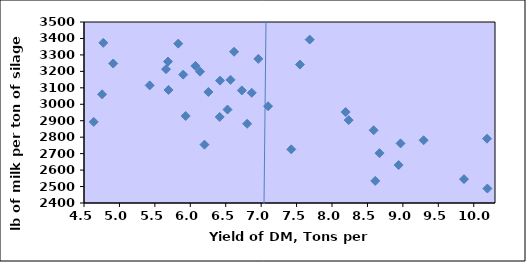
| Category | Series 0 |
|---|---|
| 8.67 | 2702.75 |
| 5.4266667 | 3115 |
| 4.7725 | 3373.5 |
| 6.8675 | 3069.75 |
| 8.235 | 2903.75 |
| 7.0975 | 2988.25 |
| 5.935 | 2928.75 |
| 10.1875 | 2790.75 |
| 8.5875 | 2842 |
| 8.9675 | 2762.25 |
| 6.525 | 2968 |
| 7.5475 | 3241.25 |
| 4.755 | 3060.5 |
| 8.1925 | 2953 |
| 4.6375 | 2892.75 |
| 6.2 | 2754.5 |
| 6.255 | 3074.5 |
| 5.6575 | 3213 |
| 6.5675 | 3148.75 |
| 7.685 | 3393 |
| 5.685 | 3259.75 |
| 6.6175 | 3319.25 |
| 6.7275 | 3084.25 |
| 6.42 | 3143.667 |
| 5.83 | 3368.5 |
| 7.425 | 2726.25 |
| 4.9125 | 3247.75 |
| 5.9 | 3180.25 |
| 6.0725 | 3233.25 |
| 6.415 | 2923 |
| 8.94 | 2630.5 |
| 8.61 | 2534.25 |
| 5.6925 | 3087 |
| 6.1375 | 3198.25 |
| 6.96 | 3275.75 |
| 6.8025 | 2881.5 |
| 9.2925 | 2781.25 |
| 10.1925 | 2487.75 |
| 9.8625 | 2545 |